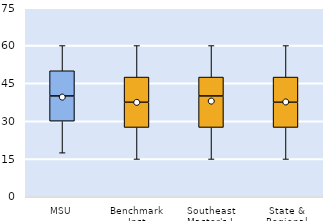
| Category | 25th | 50th | 75th |
|---|---|---|---|
| MSU | 30 | 10 | 10 |
| Benchmark Inst | 27.5 | 10 | 10 |
| Southeast Master's-L | 27.5 | 12.5 | 7.5 |
| State & Regional | 27.5 | 10 | 10 |